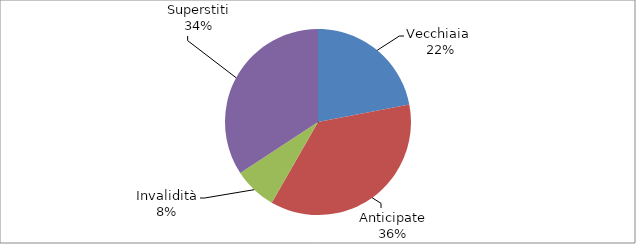
| Category | Series 0 |
|---|---|
| Vecchiaia  | 71574 |
| Anticipate | 118328 |
| Invalidità | 24356 |
| Superstiti | 111526 |